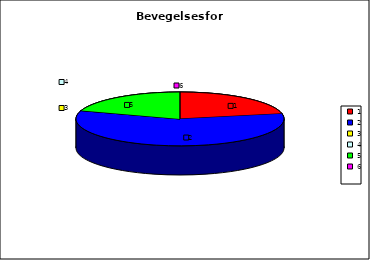
| Category | Series 0 |
|---|---|
| 0 | 5.7 |
| 1 | 15.1 |
| 2 | 0 |
| 3 | 0 |
| 4 | 5.2 |
| 5 | 0 |